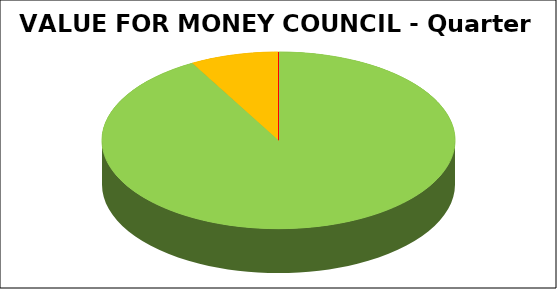
| Category | Series 0 |
|---|---|
| Green | 0.919 |
| Amber | 0.081 |
| Red | 0 |